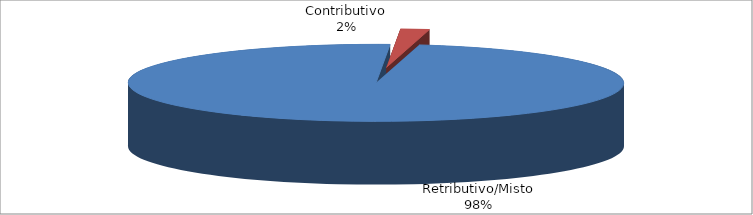
| Category | Decorrenti gennaio - settembre 2019 |
|---|---|
| Retributivo/Misto | 22430 |
| Contributivo | 428 |